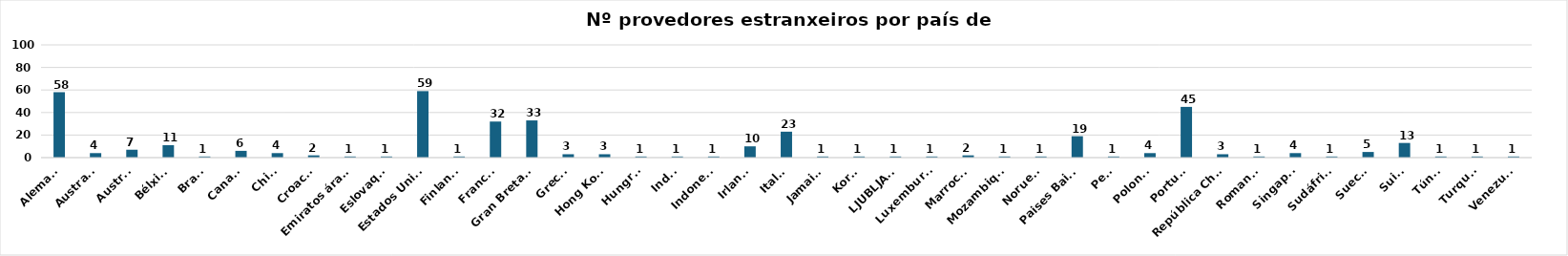
| Category | Series 0 |
|---|---|
| Alemaña | 58 |
| Australia | 4 |
| Austria | 7 |
| Bélxica | 11 |
| Brasil | 1 |
| Canadá | 6 |
| China | 4 |
| Croacia | 2 |
| Emiratos árabes | 1 |
| Eslovaquia | 1 |
| Estados Unidos | 59 |
| Finlandia | 1 |
| Francia | 32 |
| Gran Bretaña | 33 |
| Grecia | 3 |
| Hong Kong | 3 |
| Hungría | 1 |
| India | 1 |
| Indonesia | 1 |
| Irlanda | 10 |
| Italia | 23 |
| Jamaica | 1 |
| Korea | 1 |
| LJUBLJANA | 1 |
| Luxemburgo | 1 |
| Marrocos | 2 |
| Mozambique | 1 |
| Noruega | 1 |
| Paises Baixos | 19 |
| Perú | 1 |
| Polonia | 4 |
| Portugal | 45 |
| República Checa | 3 |
| Romanía | 1 |
| Singapur | 4 |
| Sudáfrica | 1 |
| Suecia | 5 |
| Suiza | 13 |
| Túnez | 1 |
| Turquía | 1 |
| Venezuela | 1 |